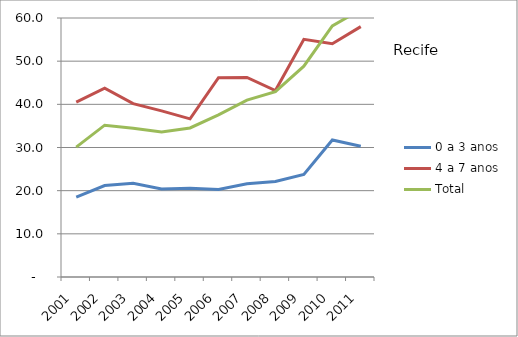
| Category | 0 a 3 anos | 4 a 7 anos | Total |
|---|---|---|---|
| 2001.0 | 18.48 | 40.52 | 30.1 |
| 2002.0 | 21.18 | 43.73 | 35.17 |
| 2003.0 | 21.7 | 40.15 | 34.48 |
| 2004.0 | 20.41 | 38.49 | 33.6 |
| 2005.0 | 20.56 | 36.63 | 34.53 |
| 2006.0 | 20.26 | 46.16 | 37.55 |
| 2007.0 | 21.61 | 46.23 | 40.98 |
| 2008.0 | 22.12 | 43.19 | 42.93 |
| 2009.0 | 23.78 | 55.05 | 48.83 |
| 2010.0 | 31.74 | 54.04 | 58.15 |
| 2011.0 | 30.31 | 58.01 | 61.96 |